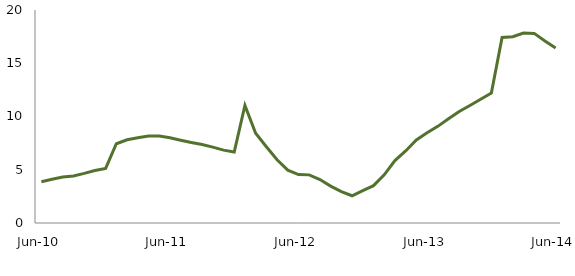
| Category | Series 0 |
|---|---|
| Jun-10 | 3.874 |
|  | 4.112 |
|  | 4.321 |
|  | 4.42 |
|  | 4.657 |
|  | 4.929 |
|  | 5.12 |
|  | 7.444 |
|  | 7.818 |
|  | 8.012 |
|  | 8.161 |
|  | 8.168 |
| Jun-11 | 8.004 |
|  | 7.769 |
|  | 7.555 |
|  | 7.367 |
|  | 7.122 |
|  | 6.84 |
|  | 6.661 |
|  | 11.044 |
|  | 8.43 |
|  | 7.165 |
|  | 5.933 |
|  | 4.965 |
| Jun-12 | 4.549 |
|  | 4.519 |
|  | 4.08 |
|  | 3.461 |
|  | 2.94 |
|  | 2.557 |
|  | 3.045 |
|  | 3.508 |
|  | 4.519 |
|  | 5.862 |
|  | 6.765 |
|  | 7.803 |
| Jun-13 | 8.471 |
|  | 9.075 |
|  | 9.787 |
|  | 10.468 |
|  | 11.036 |
|  | 11.622 |
|  | 12.2 |
|  | 17.421 |
|  | 17.488 |
|  | 17.829 |
|  | 17.803 |
|  | 17.087 |
| Jun-14 | 16.432 |